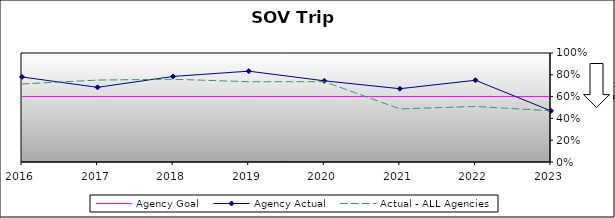
| Category | Agency Goal | Agency Actual | Actual - ALL Agencies |
|---|---|---|---|
| 2016.0 | 0.6 | 0.78 | 0.716 |
| 2017.0 | 0.6 | 0.685 | 0.752 |
| 2018.0 | 0.6 | 0.785 | 0.759 |
| 2019.0 | 0.6 | 0.833 | 0.736 |
| 2020.0 | 0.6 | 0.745 | 0.737 |
| 2021.0 | 0.6 | 0.672 | 0.487 |
| 2022.0 | 0.6 | 0.75 | 0.509 |
| 2023.0 | 0.6 | 0.469 | 0.47 |